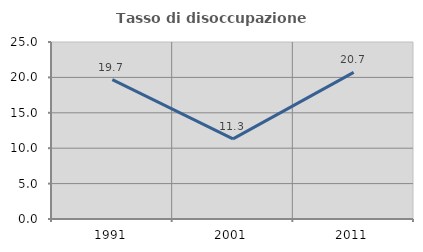
| Category | Tasso di disoccupazione giovanile  |
|---|---|
| 1991.0 | 19.691 |
| 2001.0 | 11.311 |
| 2011.0 | 20.705 |